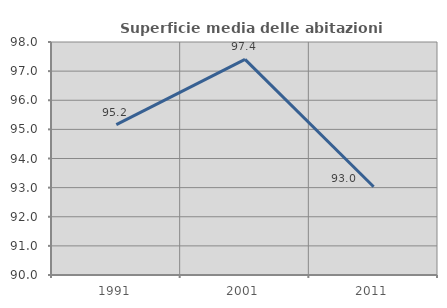
| Category | Superficie media delle abitazioni occupate |
|---|---|
| 1991.0 | 95.165 |
| 2001.0 | 97.404 |
| 2011.0 | 93.028 |